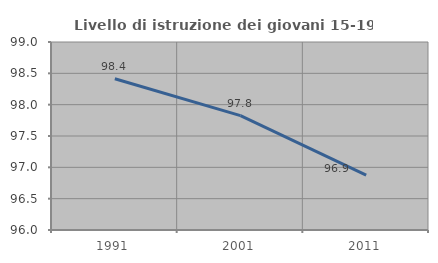
| Category | Livello di istruzione dei giovani 15-19 anni |
|---|---|
| 1991.0 | 98.413 |
| 2001.0 | 97.826 |
| 2011.0 | 96.875 |